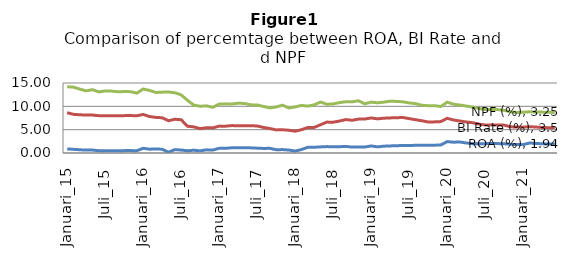
| Category | ROA (%) | BI Rate (%) | NPF (%) |
|---|---|---|---|
| Januari_15 | 0.884 | 7.75 | 5.561 |
| Februari_15 | 0.781 | 7.5 | 5.832 |
| Maret_15 | 0.693 | 7.5 | 5.49 |
| Apri_15 | 0.62 | 7.5 | 5.202 |
| Mei_15 | 0.628 | 7.5 | 5.443 |
| Juni_15 | 0.497 | 7.5 | 5.093 |
| Juli_15 | 0.497 | 7.5 | 5.302 |
| Agustus_15 | 0.461 | 7.5 | 5.302 |
| September_15 | 0.494 | 7.5 | 5.135 |
| Oktober_15 | 0.508 | 7.5 | 5.156 |
| November_15 | 0.519 | 7.5 | 5.128 |
| Desember_15 | 0.485 | 7.5 | 4.843 |
| Januari_16 | 1.008 | 7.25 | 5.456 |
| Februari_16 | 0.815 | 7 | 5.591 |
| Maret_16 | 0.878 | 6.75 | 5.347 |
| April_16 | 0.803 | 6.75 | 5.484 |
| Mei_16 | 0.162 | 6.75 | 6.168 |
| Juni_16 | 0.73 | 6.5 | 5.685 |
| Juli_16 | 0.627 | 6.5 | 5.322 |
| Agustus_16 | 0.484 | 5.25 | 5.55 |
| September_16 | 0.593 | 5 | 4.671 |
| Oktober_16 | 0.464 | 4.75 | 4.798 |
| November_16 | 0.674 | 4.75 | 4.679 |
| Desember_16 | 0.629 | 4.75 | 4.419 |
| Januari_17 | 1.01 | 4.75 | 4.72 |
| Februari_17 | 1 | 4.75 | 4.78 |
| Maret_17 | 1.12 | 4.75 | 4.61 |
| April_17 | 1.1 | 4.75 | 4.82 |
| Mei_17 | 1.11 | 4.75 | 4.75 |
| Juni_17 | 1.1 | 4.75 | 4.47 |
| Juli_17 | 1.04 | 4.75 | 4.5 |
| Agustus_17 | 0.98 | 4.5 | 4.49 |
| September_17 | 1 | 4.25 | 4.41 |
| Oktober_17 | 0.7 | 4.25 | 4.91 |
| November_17 | 0.73 | 4.25 | 5.27 |
| Desember_17 | 0.63 | 4.25 | 4.77 |
| Januari_18 | 0.42 | 4.25 | 5.21 |
| Februari_18 | 0.74 | 4.25 | 5.21 |
| Maret_18 | 1.23 | 4.25 | 4.56 |
| April_18 | 1.23 | 4.25 | 4.84 |
| Mei_18 | 1.31 | 4.75 | 4.86 |
| Juni_18 | 1.37 | 5.25 | 3.83 |
| Juli_18 | 1.35 | 5.25 | 3.92 |
| Agustus_18 | 1.35 | 5.5 | 3.95 |
| September_18 | 1.41 | 5.75 | 3.82 |
| Oktober_18 | 1.26 | 5.75 | 3.95 |
| November_18 | 1.26 | 6 | 3.93 |
| Desember_18 | 1.28 | 6 | 3.26 |
| Januari_19 | 1.51 | 6 | 3.39 |
| Februari_19 | 1.32 | 6 | 3.44 |
| Maret_19 | 1.46 | 6 | 3.44 |
| April_19 | 1.52 | 6 | 3.58 |
| Mei_19 | 1.56 | 6 | 3.49 |
| Juni_19 | 1.61 | 6 | 3.36 |
| Juli_19 | 1.62 | 5.75 | 3.36 |
| Agustus_19 | 1.64 | 5.5 | 3.44 |
| September_19 | 1.66 | 5.25 | 3.32 |
| Oktober_19 | 1.65 | 5 | 3.49 |
| November_19 | 1.67 | 5 | 3.47 |
| Desember_19 | 1.73 | 5 | 3.23 |
| Januari_20 | 2.437 | 5 | 3.46 |
| Februari_20 | 2.32 | 4.75 | 3.38 |
| Maret_20 | 2.353 | 4.5 | 3.43 |
| April_20 | 2.155 | 4.5 | 3.41 |
| Mei_20 | 1.995 | 4.5 | 3.35 |
| Juni_20 | 1.949 | 4.25 | 3.34 |
| Juli_20 | 2.007 | 4 | 3.31 |
| Agustus_20 | 2.028 | 4 | 3.3 |
| September_20 | 2.016 | 4 | 3.28 |
| Oktober_20 | 1.971 | 4 | 3.18 |
| November_20 | 1.863 | 3.75 | 3.22 |
| Desember_20 | 1.813 | 3.75 | 3.13 |
| Januari_21 | 1.792 | 3.75 | 3.195 |
| Februari_21 | 2.146 | 3.5 | 3.184 |
| Maret_21 | 2.059 | 3.5 | 3.233 |
| April_21 | 1.972 | 3.5 | 3.291 |
| Mei_21 | 1.925 | 3.5 | 3.296 |
| Juni_21 | 1.944 | 3.5 | 3.249 |